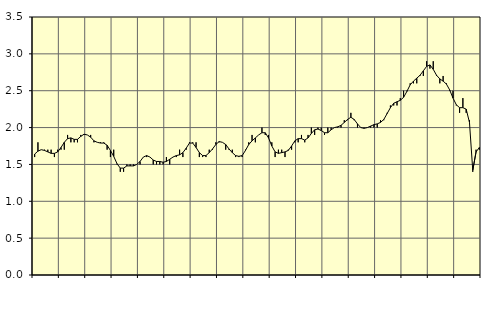
| Category | Piggar | Series 1 |
|---|---|---|
| nan | 1.6 | 1.64 |
| 87.0 | 1.8 | 1.68 |
| 87.0 | 1.7 | 1.7 |
| 87.0 | 1.7 | 1.69 |
| nan | 1.7 | 1.67 |
| 88.0 | 1.7 | 1.65 |
| 88.0 | 1.6 | 1.65 |
| 88.0 | 1.7 | 1.67 |
| nan | 1.7 | 1.73 |
| 89.0 | 1.7 | 1.8 |
| 89.0 | 1.9 | 1.85 |
| 89.0 | 1.8 | 1.86 |
| nan | 1.8 | 1.84 |
| 90.0 | 1.8 | 1.84 |
| 90.0 | 1.9 | 1.88 |
| 90.0 | 1.9 | 1.91 |
| nan | 1.9 | 1.9 |
| 91.0 | 1.9 | 1.87 |
| 91.0 | 1.8 | 1.82 |
| 91.0 | 1.8 | 1.8 |
| nan | 1.8 | 1.79 |
| 92.0 | 1.8 | 1.79 |
| 92.0 | 1.7 | 1.76 |
| 92.0 | 1.6 | 1.69 |
| nan | 1.7 | 1.61 |
| 93.0 | 1.5 | 1.51 |
| 93.0 | 1.4 | 1.45 |
| 93.0 | 1.4 | 1.45 |
| nan | 1.5 | 1.48 |
| 94.0 | 1.5 | 1.48 |
| 94.0 | 1.5 | 1.48 |
| 94.0 | 1.5 | 1.5 |
| nan | 1.5 | 1.54 |
| 95.0 | 1.6 | 1.6 |
| 95.0 | 1.6 | 1.62 |
| 95.0 | 1.6 | 1.6 |
| nan | 1.5 | 1.56 |
| 96.0 | 1.5 | 1.54 |
| 96.0 | 1.5 | 1.54 |
| 96.0 | 1.5 | 1.53 |
| nan | 1.6 | 1.54 |
| 97.0 | 1.5 | 1.57 |
| 97.0 | 1.6 | 1.6 |
| 97.0 | 1.6 | 1.62 |
| nan | 1.7 | 1.63 |
| 98.0 | 1.6 | 1.66 |
| 98.0 | 1.7 | 1.72 |
| 98.0 | 1.8 | 1.79 |
| nan | 1.8 | 1.79 |
| 99.0 | 1.8 | 1.73 |
| 99.0 | 1.6 | 1.66 |
| 99.0 | 1.6 | 1.62 |
| nan | 1.6 | 1.62 |
| 0.0 | 1.7 | 1.66 |
| 0.0 | 1.7 | 1.71 |
| 0.0 | 1.8 | 1.77 |
| nan | 1.8 | 1.81 |
| 1.0 | 1.8 | 1.8 |
| 1.0 | 1.7 | 1.77 |
| 1.0 | 1.7 | 1.71 |
| nan | 1.7 | 1.66 |
| 2.0 | 1.6 | 1.62 |
| 2.0 | 1.6 | 1.61 |
| 2.0 | 1.6 | 1.62 |
| nan | 1.7 | 1.69 |
| 3.0 | 1.8 | 1.77 |
| 3.0 | 1.9 | 1.82 |
| 3.0 | 1.8 | 1.86 |
| nan | 1.9 | 1.9 |
| 4.0 | 2 | 1.93 |
| 4.0 | 1.9 | 1.93 |
| 4.0 | 1.9 | 1.86 |
| nan | 1.8 | 1.75 |
| 5.0 | 1.6 | 1.67 |
| 5.0 | 1.7 | 1.65 |
| 5.0 | 1.7 | 1.66 |
| nan | 1.6 | 1.67 |
| 6.0 | 1.7 | 1.69 |
| 6.0 | 1.7 | 1.75 |
| 6.0 | 1.8 | 1.82 |
| nan | 1.8 | 1.85 |
| 7.0 | 1.9 | 1.85 |
| 7.0 | 1.8 | 1.83 |
| 7.0 | 1.9 | 1.86 |
| nan | 2 | 1.92 |
| 8.0 | 1.9 | 1.97 |
| 8.0 | 2 | 1.98 |
| 8.0 | 2 | 1.96 |
| nan | 1.9 | 1.93 |
| 9.0 | 2 | 1.93 |
| 9.0 | 2 | 1.97 |
| 9.0 | 2 | 2 |
| nan | 2 | 2.01 |
| 10.0 | 2 | 2.03 |
| 10.0 | 2.1 | 2.07 |
| 10.0 | 2.1 | 2.11 |
| nan | 2.2 | 2.14 |
| 11.0 | 2.1 | 2.11 |
| 11.0 | 2 | 2.05 |
| 11.0 | 2 | 2 |
| nan | 2 | 1.99 |
| 12.0 | 2 | 2 |
| 12.0 | 2 | 2.02 |
| 12.0 | 2 | 2.04 |
| nan | 2 | 2.05 |
| 13.0 | 2.1 | 2.07 |
| 13.0 | 2.1 | 2.11 |
| 13.0 | 2.2 | 2.19 |
| nan | 2.3 | 2.27 |
| 14.0 | 2.3 | 2.33 |
| 14.0 | 2.3 | 2.35 |
| 14.0 | 2.4 | 2.37 |
| nan | 2.5 | 2.41 |
| 15.0 | 2.5 | 2.49 |
| 15.0 | 2.6 | 2.58 |
| 15.0 | 2.6 | 2.63 |
| nan | 2.6 | 2.67 |
| 16.0 | 2.7 | 2.71 |
| 16.0 | 2.7 | 2.77 |
| 16.0 | 2.9 | 2.83 |
| nan | 2.8 | 2.85 |
| 17.0 | 2.9 | 2.79 |
| 17.0 | 2.7 | 2.71 |
| 17.0 | 2.6 | 2.66 |
| nan | 2.7 | 2.63 |
| 18.0 | 2.6 | 2.59 |
| 18.0 | 2.5 | 2.51 |
| 18.0 | 2.5 | 2.4 |
| nan | 2.3 | 2.31 |
| 19.0 | 2.2 | 2.27 |
| 19.0 | 2.4 | 2.27 |
| 19.0 | 2.2 | 2.25 |
| nan | 2.1 | 2.07 |
| 20.0 | 1.4 | 1.42 |
| 20.0 | 1.7 | 1.67 |
| 20.0 | 1.7 | 1.73 |